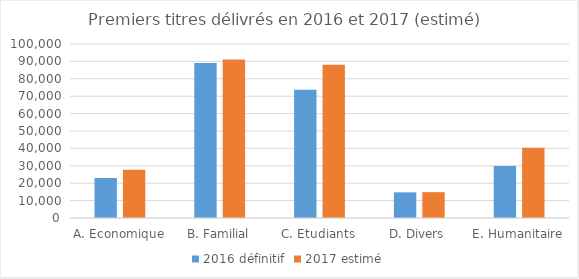
| Category | 2016 définitif | 2017 estimé |
|---|---|---|
| A. Economique | 22982 | 27690 |
| B. Familial | 89124 | 91070 |
| C. Etudiants | 73644 | 88095 |
| D. Divers | 14741 | 14840 |
| E. Humanitaire | 29862 | 40305 |